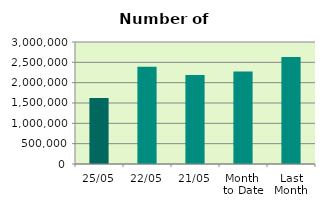
| Category | Series 0 |
|---|---|
| 25/05 | 1620230 |
| 22/05 | 2393068 |
| 21/05 | 2187980 |
| Month 
to Date | 2273914.375 |
| Last
Month | 2628131 |